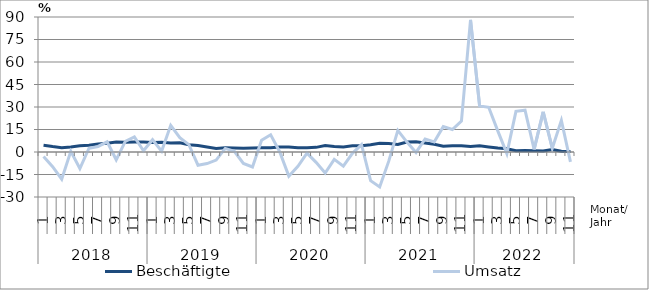
| Category | Beschäftigte | Umsatz |
|---|---|---|
| 0 | 4.5 | -3 |
| 1 | 3.6 | -9.8 |
| 2 | 2.9 | -18.1 |
| 3 | 3.4 | 0.5 |
| 4 | 4.2 | -11 |
| 5 | 4.5 | 2.5 |
| 6 | 5.3 | 3.7 |
| 7 | 5.8 | 6.8 |
| 8 | 6.6 | -5.2 |
| 9 | 6.5 | 7.1 |
| 10 | 6.6 | 10.1 |
| 11 | 6.6 | 0.8 |
| 12 | 6.4 | 8.2 |
| 13 | 6.5 | 0.6 |
| 14 | 6 | 17.8 |
| 15 | 6.1 | 9.6 |
| 16 | 4.9 | 4.9 |
| 17 | 4.3 | -8.8 |
| 18 | 3.3 | -7.7 |
| 19 | 2.4 | -5.4 |
| 20 | 2.8 | 2.4 |
| 21 | 2.7 | 0.5 |
| 22 | 2.5 | -7.6 |
| 23 | 2.7 | -10 |
| 24 | 2.9 | 7.8 |
| 25 | 2.9 | 11.5 |
| 26 | 3.4 | 0.1 |
| 27 | 3.4 | -16.1 |
| 28 | 2.9 | -9.5 |
| 29 | 2.9 | -0.8 |
| 30 | 3.1 | -6.9 |
| 31 | 4.3 | -14 |
| 32 | 3.6 | -4.9 |
| 33 | 3.4 | -9.4 |
| 34 | 4.1 | -0.9 |
| 35 | 4.1 | 4.9 |
| 36 | 4.8 | -19.1 |
| 37 | 5.8 | -23.3 |
| 38 | 5.6 | -6.1 |
| 39 | 5 | 14.4 |
| 40 | 6.6 | 6.6 |
| 41 | 6.9 | -0.3 |
| 42 | 6 | 8.7 |
| 43 | 5.2 | 6.7 |
| 44 | 3.8 | 16.9 |
| 45 | 4.2 | 15 |
| 46 | 4.2 | 20.6 |
| 47 | 3.7 | 88.1 |
| 48 | 4.1 | 30.7 |
| 49 | 3.4 | 29.8 |
| 50 | 2.6 | 14.1 |
| 51 | 2.1 | -1.1 |
| 52 | 0.9 | 27.1 |
| 53 | 1 | 27.9 |
| 54 | 0.8 | 1.7 |
| 55 | 0.6 | 26.8 |
| 56 | 1.6 | 2.5 |
| 57 | 0.5 | 21.1 |
| 58 | 0.3 | -6.6 |